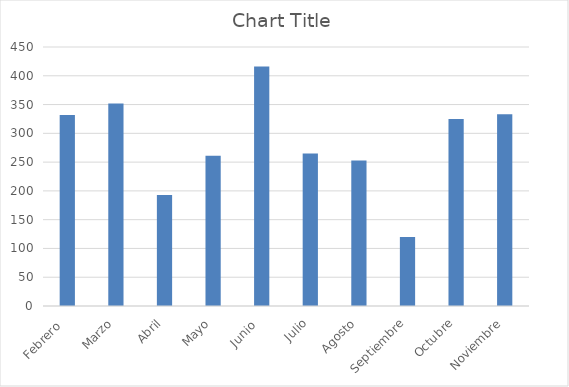
| Category | Series 0 |
|---|---|
| Febrero  | 332 |
| Marzo | 352 |
| Abril | 193 |
| Mayo | 261 |
| Junio  | 416 |
| Julio | 265 |
| Agosto | 253 |
| Septiembre | 120 |
| Octubre | 325 |
| Noviembre | 333 |